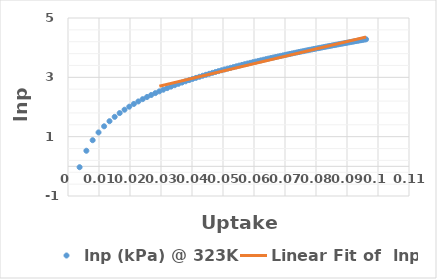
| Category | lnp (kPa) @ 323K |
|---|---|
| 0.00374 | -0.03 |
| 0.00593 | 0.525 |
| 0.00795 | 0.881 |
| 0.00985 | 1.143 |
| 0.01165 | 1.349 |
| 0.01339 | 1.522 |
| 0.01506 | 1.668 |
| 0.01667 | 1.795 |
| 0.01824 | 1.909 |
| 0.01976 | 2.01 |
| 0.02124 | 2.102 |
| 0.02269 | 2.187 |
| 0.0241 | 2.265 |
| 0.02549 | 2.337 |
| 0.02684 | 2.405 |
| 0.02817 | 2.468 |
| 0.02947 | 2.527 |
| 0.03074 | 2.583 |
| 0.03199 | 2.636 |
| 0.03322 | 2.687 |
| 0.03443 | 2.735 |
| 0.03562 | 2.78 |
| 0.03679 | 2.824 |
| 0.03794 | 2.866 |
| 0.03908 | 2.907 |
| 0.04019 | 2.945 |
| 0.04129 | 2.982 |
| 0.04238 | 3.018 |
| 0.04345 | 3.053 |
| 0.0445 | 3.087 |
| 0.04554 | 3.119 |
| 0.04656 | 3.15 |
| 0.04758 | 3.181 |
| 0.04857 | 3.21 |
| 0.04956 | 3.239 |
| 0.05053 | 3.267 |
| 0.0515 | 3.294 |
| 0.05245 | 3.321 |
| 0.05338 | 3.346 |
| 0.05431 | 3.371 |
| 0.05523 | 3.396 |
| 0.05613 | 3.42 |
| 0.05703 | 3.443 |
| 0.05791 | 3.466 |
| 0.05879 | 3.488 |
| 0.05965 | 3.51 |
| 0.06051 | 3.531 |
| 0.06136 | 3.552 |
| 0.0622 | 3.573 |
| 0.06303 | 3.593 |
| 0.06385 | 3.613 |
| 0.06466 | 3.632 |
| 0.06546 | 3.651 |
| 0.06626 | 3.669 |
| 0.06705 | 3.688 |
| 0.06783 | 3.705 |
| 0.0686 | 3.723 |
| 0.06936 | 3.74 |
| 0.07012 | 3.757 |
| 0.07087 | 3.774 |
| 0.07161 | 3.79 |
| 0.07235 | 3.807 |
| 0.07308 | 3.822 |
| 0.0738 | 3.838 |
| 0.07452 | 3.854 |
| 0.07523 | 3.869 |
| 0.07593 | 3.884 |
| 0.07663 | 3.898 |
| 0.07732 | 3.913 |
| 0.07801 | 3.927 |
| 0.07868 | 3.941 |
| 0.07936 | 3.955 |
| 0.08002 | 3.969 |
| 0.08069 | 3.983 |
| 0.08134 | 3.996 |
| 0.08199 | 4.009 |
| 0.08264 | 4.022 |
| 0.08328 | 4.035 |
| 0.08391 | 4.048 |
| 0.08454 | 4.06 |
| 0.08516 | 4.072 |
| 0.08578 | 4.085 |
| 0.0864 | 4.097 |
| 0.08701 | 4.109 |
| 0.08761 | 4.121 |
| 0.08821 | 4.132 |
| 0.08881 | 4.144 |
| 0.0894 | 4.155 |
| 0.08998 | 4.166 |
| 0.09057 | 4.178 |
| 0.09114 | 4.188 |
| 0.09171 | 4.199 |
| 0.09228 | 4.21 |
| 0.09285 | 4.221 |
| 0.09341 | 4.231 |
| 0.09396 | 4.242 |
| 0.09452 | 4.252 |
| 0.09506 | 4.262 |
| 0.09561 | 4.273 |
| 0.09615 | 4.283 |